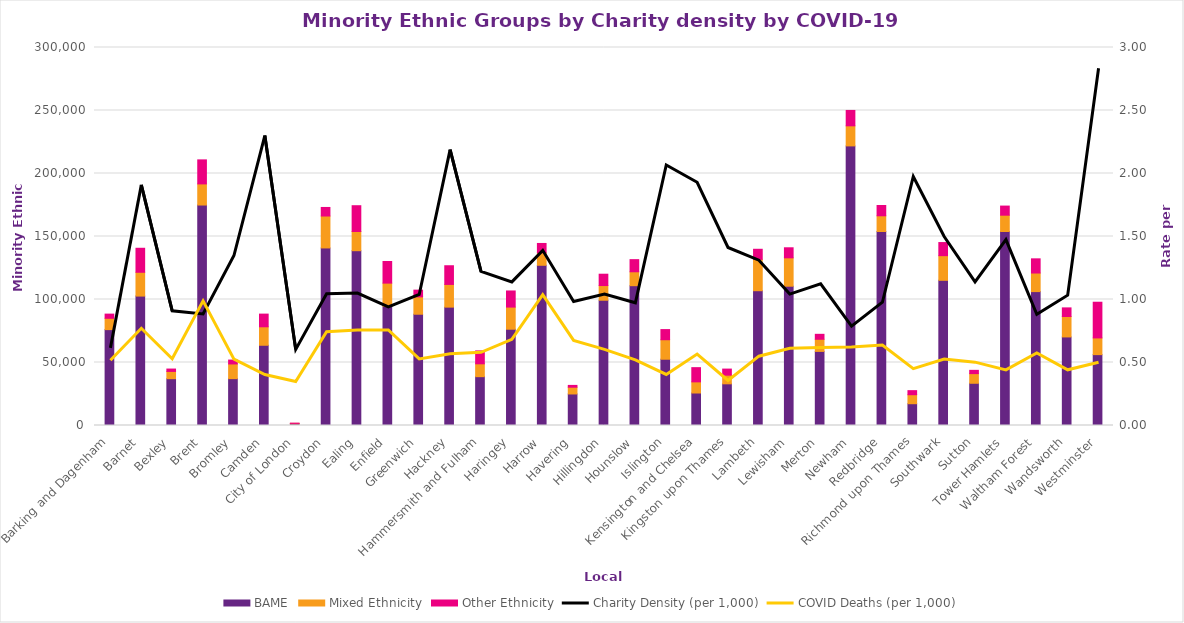
| Category | BAME | Mixed Ethnicity | Other Ethnicity |
|---|---|---|---|
| Barking and Dagenham | 76098.104 | 8983.44 | 3321.752 |
| Barnet | 102714.127 | 18891.459 | 19052.107 |
| Bexley | 37160.587 | 5749.889 | 1889.63 |
| Brent | 174974.893 | 16767.479 | 19070.816 |
| Bromley | 37190.94 | 11661.43 | 3073.472 |
| Camden | 63677.915 | 14664.51 | 10062.363 |
| City of London | 1337.478 | 341.157 | 181.793 |
| Croydon | 140916.436 | 25339.571 | 6792.214 |
| Ealing | 138732.236 | 15223.271 | 20477.553 |
| Enfield | 94647.469 | 18359.985 | 17163.268 |
| Greenwich | 88308.804 | 13799.059 | 5319.956 |
| Hackney | 93942.775 | 18020.887 | 14829.842 |
| Hammersmith and Fulham | 38752.98 | 10205.426 | 10249.117 |
| Haringey | 76412.432 | 17567.004 | 12797.331 |
| Harrow | 127154.75 | 9939.785 | 7377.144 |
| Havering | 25023.323 | 5360.899 | 1438.847 |
| Hillingdon | 99408.081 | 11660.573 | 9003.311 |
| Hounslow | 110964.78 | 11034.635 | 9631.449 |
| Islington | 52588.616 | 15475.634 | 8055.126 |
| Kensington and Chelsea | 25789.159 | 8847.117 | 11275.004 |
| Kingston upon Thames | 33077.948 | 6872.557 | 4822.52 |
| Lambeth | 106973.675 | 24904.607 | 7980.012 |
| Lewisham | 110546.362 | 22523.838 | 7977.743 |
| Merton | 58805.854 | 9637.494 | 3922.524 |
| Newham | 221901.536 | 15938.197 | 12197.378 |
| Redbridge | 153958.205 | 12478.034 | 8190.888 |
| Richmond upon Thames | 17293.729 | 7139.468 | 3224.344 |
| Southwark | 115225.854 | 19564.723 | 10403.045 |
| Sutton | 33510.967 | 7673.479 | 2590.095 |
| Tower Hamlets | 153953.689 | 12953.466 | 7235.686 |
| Waltham Forest | 106266.069 | 14749.533 | 11254.475 |
| Wandsworth | 70287.7 | 16208.05 | 6852.875 |
| Westminster | 56249.112 | 13261.03 | 28322.395 |